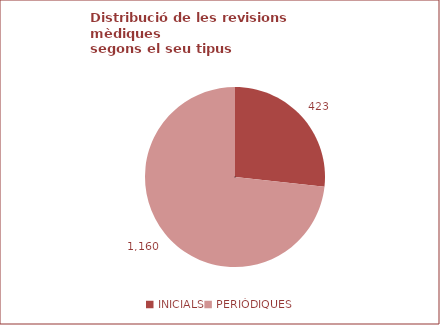
| Category |  TOTAL |
|---|---|
| INICIALS | 423 |
| PERIÒDIQUES | 1160 |